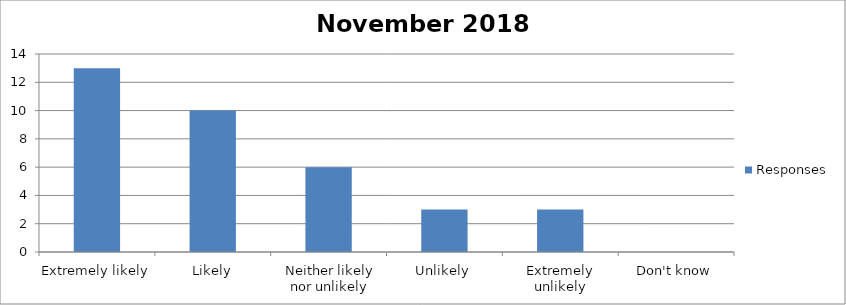
| Category | Responses |
|---|---|
| Extremely likely | 13 |
| Likely | 10 |
| Neither likely nor unlikely | 6 |
| Unlikely | 3 |
| Extremely unlikely | 3 |
| Don't know | 0 |